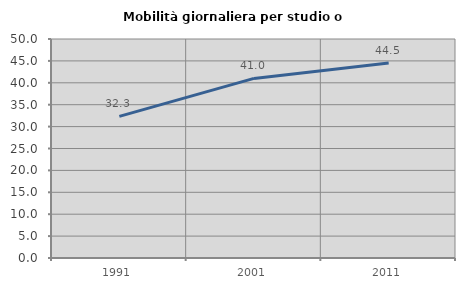
| Category | Mobilità giornaliera per studio o lavoro |
|---|---|
| 1991.0 | 32.335 |
| 2001.0 | 40.998 |
| 2011.0 | 44.546 |